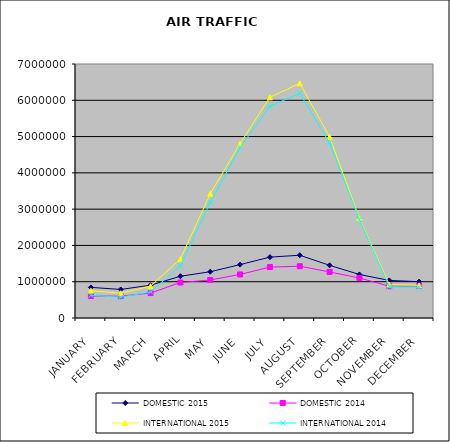
| Category | DOMESTIC 2015 | DOMESTIC 2014 | INTERNATIONAL 2015 | INTERNATIONAL 2014 |
|---|---|---|---|---|
| JANUARY | 844240 | 605894 | 754299 | 625045 |
| FEBRUARY | 786696 | 601285 | 682203 | 571905 |
| MARCH | 904804 | 686964 | 879061 | 719389 |
| APRIL | 1150732 | 977628 | 1624854 | 1438399 |
| MAY | 1274767 | 1048085 | 3423898 | 3185210 |
| JUNE | 1471679 | 1200545 | 4805825 | 4699237 |
| JULY | 1677449 | 1403252 | 6080592 | 5832928 |
| AUGUST | 1729657 | 1427189 | 6469273 | 6193839 |
| SEPTEMBER | 1451763 | 1269365 | 4995242 | 4823076 |
| OCTOBER | 1199989 | 1101704 | 2744792 | 2715213 |
| NOVEMBER | 1035216 | 875238 | 921451 | 864810 |
| DECEMBER | 1001882 | 883832 | 901238 | 842242 |